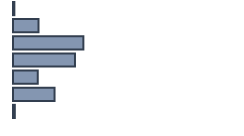
| Category | Series 0 |
|---|---|
| 0 | 0.6 |
| 1 | 11.2 |
| 2 | 31 |
| 3 | 27.3 |
| 4 | 10.9 |
| 5 | 18.3 |
| 6 | 0.8 |